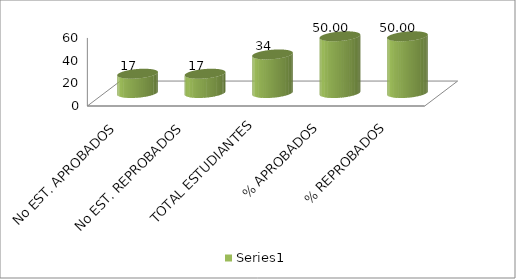
| Category | Series 0 |
|---|---|
| No EST. APROBADOS | 17 |
| No EST. REPROBADOS | 17 |
| TOTAL ESTUDIANTES | 34 |
| % APROBADOS | 50 |
| % REPROBADOS | 50 |